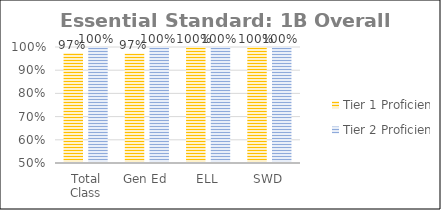
| Category | Tier 1 Proficiency | Tier 2 Proficiency |
|---|---|---|
| Total Class | 0.974 | 1 |
| Gen Ed | 0.972 | 1 |
| ELL | 1 | 1 |
| SWD | 1 | 1 |